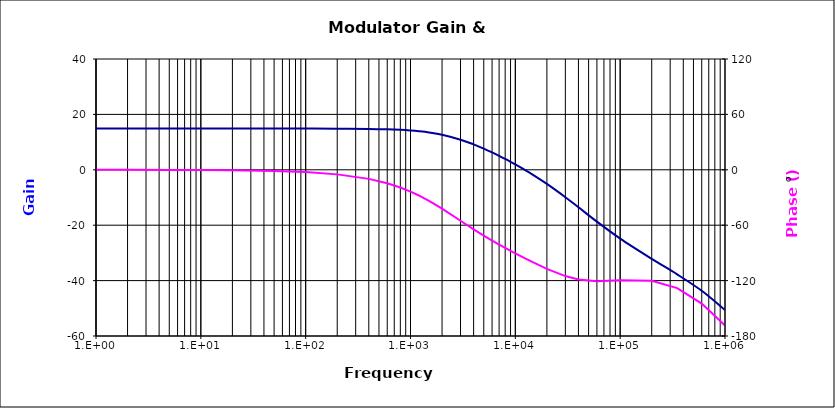
| Category | Series 0 |
|---|---|
| 1.0 | 14.88 |
| 2.0 | 14.88 |
| 5.0 | 14.88 |
| 10.0 | 14.88 |
| 20.0 | 14.88 |
| 50.0 | 14.878 |
| 100.0 | 14.873 |
| 200.0 | 14.851 |
| 400.0 | 14.766 |
| 600.0 | 14.627 |
| 800.0 | 14.44 |
| 1000.0 | 14.211 |
| 1200.0 | 13.946 |
| 1500.0 | 13.496 |
| 2000.0 | 12.656 |
| 3000.0 | 10.876 |
| 4000.0 | 9.179 |
| 5000.0 | 7.644 |
| 6000.0 | 6.267 |
| 7000.0 | 5.029 |
| 8000.0 | 3.905 |
| 9000.0 | 2.875 |
| 10000.0 | 1.924 |
| 12000.0 | 0.21 |
| 15000.0 | -2.014 |
| 20000.0 | -5.107 |
| 30000.0 | -9.902 |
| 40000.0 | -13.538 |
| 60000.0 | -18.718 |
| 100000.0 | -24.836 |
| 200000.0 | -32.142 |
| 350000.0 | -37.756 |
| 600000.0 | -43.686 |
| 1000000.0 | -50.611 |